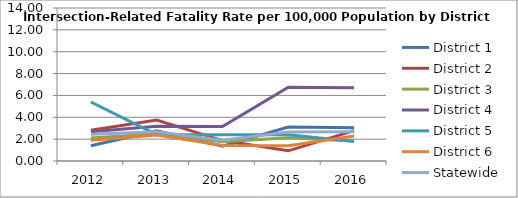
| Category | District 1 | District 2 | District 3 | District 4 | District 5 | District 6 | Statewide |
|---|---|---|---|---|---|---|---|
| 2012.0 | 1.392 | 2.817 | 2.112 | 2.671 | 5.397 | 1.909 | 2.444 |
| 2013.0 | 2.758 | 3.753 | 2.492 | 3.177 | 2.408 | 2.375 | 2.667 |
| 2014.0 | 1.355 | 1.869 | 1.764 | 3.15 | 2.406 | 1.413 | 1.897 |
| 2015.0 | 3.111 | 0.931 | 2.134 | 6.757 | 2.403 | 1.401 | 2.659 |
| 2016.0 | 3.043 | 2.776 | 1.83 | 6.703 | 1.788 | 2.291 | 2.674 |